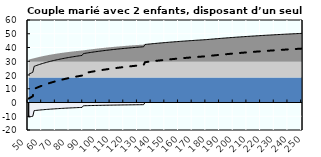
| Category | Coin fiscal moyen (somme des composantes) | Taux moyen d'imposition net en % du salaire brut |
|---|---|---|
| 50.0 | 20.554 | 2.845 |
| 51.0 | 21.034 | 3.433 |
| 52.0 | 21.496 | 3.998 |
| 53.0 | 21.941 | 4.542 |
| 54.0 | 26.305 | 9.878 |
| 55.0 | 26.671 | 10.326 |
| 56.0 | 27.025 | 10.759 |
| 57.0 | 27.366 | 11.176 |
| 58.0 | 27.695 | 11.579 |
| 59.0 | 28.014 | 11.968 |
| 60.0 | 28.321 | 12.344 |
| 61.0 | 28.619 | 12.708 |
| 62.0 | 28.907 | 13.06 |
| 63.0 | 29.186 | 13.401 |
| 64.0 | 29.456 | 13.732 |
| 65.0 | 29.718 | 14.052 |
| 66.0 | 29.971 | 14.362 |
| 67.0 | 30.218 | 14.663 |
| 68.0 | 30.457 | 14.956 |
| 69.0 | 30.689 | 15.239 |
| 70.0 | 30.914 | 15.515 |
| 71.0 | 31.134 | 15.783 |
| 72.0 | 31.347 | 16.044 |
| 73.0 | 31.554 | 16.297 |
| 74.0 | 31.755 | 16.544 |
| 75.0 | 31.952 | 16.784 |
| 76.0 | 32.143 | 17.017 |
| 77.0 | 32.329 | 17.245 |
| 78.0 | 32.51 | 17.467 |
| 79.0 | 32.687 | 17.683 |
| 80.0 | 32.859 | 17.893 |
| 81.0 | 33.027 | 18.099 |
| 82.0 | 33.191 | 18.3 |
| 83.0 | 33.351 | 18.495 |
| 84.0 | 33.507 | 18.686 |
| 85.0 | 33.66 | 18.873 |
| 86.0 | 33.809 | 19.055 |
| 87.0 | 33.954 | 19.233 |
| 88.0 | 34.097 | 19.407 |
| 89.0 | 34.236 | 19.577 |
| 90.0 | 35.565 | 21.203 |
| 91.0 | 35.732 | 21.406 |
| 92.0 | 35.894 | 21.605 |
| 93.0 | 36.054 | 21.8 |
| 94.0 | 36.209 | 21.99 |
| 95.0 | 36.362 | 22.177 |
| 96.0 | 36.511 | 22.36 |
| 97.0 | 36.657 | 22.538 |
| 98.0 | 36.801 | 22.714 |
| 99.0 | 36.941 | 22.885 |
| 100.0 | 37.079 | 23.054 |
| 101.0 | 37.214 | 23.218 |
| 102.0 | 37.346 | 23.38 |
| 103.0 | 37.475 | 23.539 |
| 104.0 | 37.603 | 23.694 |
| 105.0 | 37.727 | 23.847 |
| 106.0 | 37.85 | 23.996 |
| 107.0 | 37.97 | 24.143 |
| 108.0 | 38.088 | 24.287 |
| 109.0 | 38.203 | 24.429 |
| 110.0 | 38.317 | 24.568 |
| 111.0 | 38.428 | 24.704 |
| 112.0 | 38.538 | 24.838 |
| 113.0 | 38.646 | 24.97 |
| 114.0 | 38.751 | 25.099 |
| 115.0 | 38.855 | 25.226 |
| 116.0 | 38.957 | 25.351 |
| 117.0 | 39.058 | 25.474 |
| 118.0 | 39.156 | 25.594 |
| 119.0 | 39.253 | 25.713 |
| 120.0 | 39.349 | 25.829 |
| 121.0 | 39.442 | 25.944 |
| 122.0 | 39.535 | 26.057 |
| 123.0 | 39.625 | 26.168 |
| 124.0 | 39.715 | 26.277 |
| 125.0 | 39.803 | 26.385 |
| 126.0 | 39.889 | 26.49 |
| 127.0 | 39.974 | 26.594 |
| 128.0 | 40.058 | 26.697 |
| 129.0 | 40.14 | 26.798 |
| 130.0 | 40.222 | 26.897 |
| 131.0 | 40.302 | 26.995 |
| 132.0 | 40.38 | 27.091 |
| 133.0 | 40.458 | 27.186 |
| 134.0 | 40.534 | 27.28 |
| 135.0 | 42.201 | 29.318 |
| 136.0 | 42.305 | 29.445 |
| 137.0 | 42.408 | 29.57 |
| 138.0 | 42.508 | 29.694 |
| 139.0 | 42.608 | 29.815 |
| 140.0 | 42.706 | 29.935 |
| 141.0 | 42.803 | 30.053 |
| 142.0 | 42.898 | 30.17 |
| 143.0 | 42.992 | 30.285 |
| 144.0 | 43.084 | 30.398 |
| 145.0 | 43.176 | 30.51 |
| 146.0 | 43.266 | 30.62 |
| 147.0 | 43.355 | 30.729 |
| 148.0 | 43.443 | 30.836 |
| 149.0 | 43.529 | 30.942 |
| 150.0 | 43.614 | 31.046 |
| 151.0 | 43.699 | 31.149 |
| 152.0 | 43.782 | 31.251 |
| 153.0 | 43.864 | 31.351 |
| 154.0 | 43.945 | 31.45 |
| 155.0 | 44.025 | 31.548 |
| 156.0 | 44.104 | 31.644 |
| 157.0 | 44.181 | 31.74 |
| 158.0 | 44.258 | 31.834 |
| 159.0 | 44.334 | 31.926 |
| 160.0 | 44.409 | 32.018 |
| 161.0 | 44.483 | 32.109 |
| 162.0 | 44.557 | 32.198 |
| 163.0 | 44.629 | 32.287 |
| 164.0 | 44.7 | 32.374 |
| 165.0 | 44.771 | 32.46 |
| 166.0 | 44.84 | 32.545 |
| 167.0 | 44.909 | 32.629 |
| 168.0 | 44.977 | 32.712 |
| 169.0 | 45.044 | 32.795 |
| 170.0 | 45.111 | 32.876 |
| 171.0 | 45.176 | 32.956 |
| 172.0 | 45.241 | 33.035 |
| 173.0 | 45.305 | 33.114 |
| 174.0 | 45.369 | 33.191 |
| 175.0 | 45.431 | 33.268 |
| 176.0 | 45.493 | 33.344 |
| 177.0 | 45.555 | 33.419 |
| 178.0 | 45.615 | 33.493 |
| 179.0 | 45.675 | 33.566 |
| 180.0 | 45.753 | 33.662 |
| 181.0 | 45.843 | 33.771 |
| 182.0 | 45.932 | 33.88 |
| 183.0 | 46.019 | 33.987 |
| 184.0 | 46.106 | 34.093 |
| 185.0 | 46.192 | 34.198 |
| 186.0 | 46.276 | 34.301 |
| 187.0 | 46.36 | 34.404 |
| 188.0 | 46.443 | 34.506 |
| 189.0 | 46.526 | 34.606 |
| 190.0 | 46.607 | 34.705 |
| 191.0 | 46.687 | 34.804 |
| 192.0 | 46.767 | 34.901 |
| 193.0 | 46.846 | 34.997 |
| 194.0 | 46.924 | 35.093 |
| 195.0 | 47.001 | 35.187 |
| 196.0 | 47.077 | 35.28 |
| 197.0 | 47.153 | 35.373 |
| 198.0 | 47.227 | 35.464 |
| 199.0 | 47.301 | 35.555 |
| 200.0 | 47.375 | 35.645 |
| 201.0 | 47.447 | 35.733 |
| 202.0 | 47.519 | 35.821 |
| 203.0 | 47.59 | 35.908 |
| 204.0 | 47.661 | 35.995 |
| 205.0 | 47.731 | 36.08 |
| 206.0 | 47.8 | 36.164 |
| 207.0 | 47.868 | 36.248 |
| 208.0 | 47.936 | 36.331 |
| 209.0 | 48.003 | 36.413 |
| 210.0 | 48.07 | 36.494 |
| 211.0 | 48.136 | 36.575 |
| 212.0 | 48.201 | 36.655 |
| 213.0 | 48.265 | 36.734 |
| 214.0 | 48.329 | 36.812 |
| 215.0 | 48.393 | 36.89 |
| 216.0 | 48.456 | 36.967 |
| 217.0 | 48.518 | 37.043 |
| 218.0 | 48.58 | 37.118 |
| 219.0 | 48.641 | 37.193 |
| 220.0 | 48.701 | 37.267 |
| 221.0 | 48.761 | 37.34 |
| 222.0 | 48.821 | 37.413 |
| 223.0 | 48.88 | 37.485 |
| 224.0 | 48.938 | 37.557 |
| 225.0 | 48.996 | 37.627 |
| 226.0 | 49.054 | 37.698 |
| 227.0 | 49.11 | 37.767 |
| 228.0 | 49.167 | 37.836 |
| 229.0 | 49.223 | 37.905 |
| 230.0 | 49.278 | 37.972 |
| 231.0 | 49.333 | 38.039 |
| 232.0 | 49.388 | 38.106 |
| 233.0 | 49.442 | 38.172 |
| 234.0 | 49.495 | 38.238 |
| 235.0 | 49.548 | 38.302 |
| 236.0 | 49.601 | 38.367 |
| 237.0 | 49.653 | 38.431 |
| 238.0 | 49.705 | 38.494 |
| 239.0 | 49.756 | 38.557 |
| 240.0 | 49.807 | 38.619 |
| 241.0 | 49.857 | 38.681 |
| 242.0 | 49.907 | 38.742 |
| 243.0 | 49.957 | 38.802 |
| 244.0 | 50.006 | 38.863 |
| 245.0 | 50.055 | 38.922 |
| 246.0 | 50.103 | 38.982 |
| 247.0 | 50.152 | 39.04 |
| 248.0 | 50.199 | 39.099 |
| 249.0 | 50.246 | 39.156 |
| 250.0 | 50.293 | 39.214 |